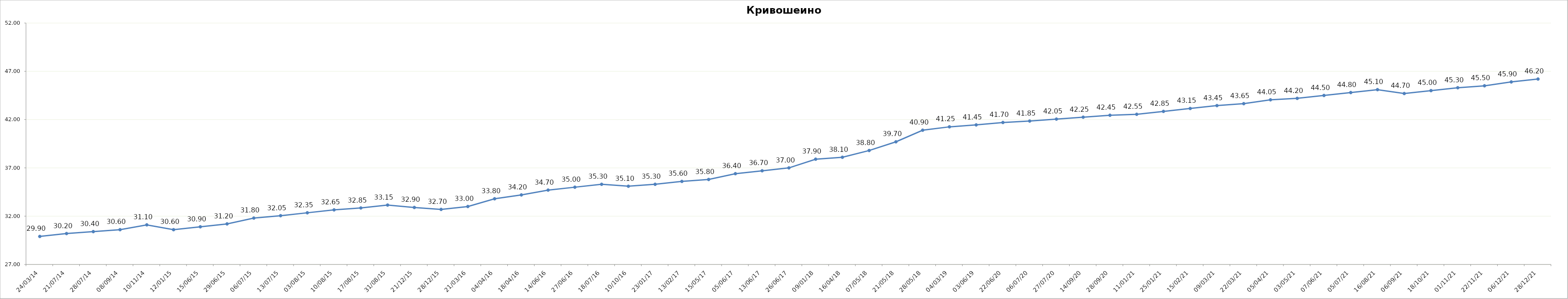
| Category | Series 0 |
|---|---|
| 2014-03-24 | 29.9 |
| 2014-07-21 | 30.2 |
| 2014-07-28 | 30.4 |
| 2014-09-08 | 30.6 |
| 2014-11-10 | 31.1 |
| 2015-01-12 | 30.6 |
| 2015-06-15 | 30.9 |
| 2015-06-29 | 31.2 |
| 2015-07-06 | 31.8 |
| 2015-07-13 | 32.05 |
| 2015-08-03 | 32.35 |
| 2015-08-10 | 32.65 |
| 2015-08-17 | 32.85 |
| 2015-08-31 | 33.15 |
| 2015-12-21 | 32.9 |
| 2015-12-28 | 32.7 |
| 2016-03-21 | 33 |
| 2016-04-04 | 33.8 |
| 2016-04-18 | 34.2 |
| 2016-06-14 | 34.7 |
| 2016-06-27 | 35 |
| 2016-07-18 | 35.3 |
| 2016-10-10 | 35.1 |
| 2017-01-23 | 35.3 |
| 2017-02-13 | 35.6 |
| 2017-05-15 | 35.8 |
| 2017-06-05 | 36.4 |
| 2017-06-13 | 36.7 |
| 2017-06-26 | 37 |
| 2018-01-09 | 37.9 |
| 2018-04-16 | 38.1 |
| 2018-05-07 | 38.8 |
| 2018-05-21 | 39.7 |
| 2018-05-28 | 40.9 |
| 2019-03-04 | 41.25 |
| 2019-06-03 | 41.45 |
| 2020-06-22 | 41.7 |
| 2020-07-06 | 41.85 |
| 2020-07-27 | 42.05 |
| 2020-09-14 | 42.25 |
| 2020-09-28 | 42.45 |
| 2021-01-11 | 42.55 |
| 2021-01-25 | 42.85 |
| 2021-02-15 | 43.15 |
| 2021-03-09 | 43.45 |
| 2021-03-22 | 43.65 |
| 2021-04-05 | 44.05 |
| 2021-05-03 | 44.2 |
| 2021-06-07 | 44.5 |
| 2021-07-05 | 44.8 |
| 2021-08-16 | 45.1 |
| 2021-09-06 | 44.7 |
| 2021-10-18 | 45 |
| 2021-11-01 | 45.3 |
| 2021-11-22 | 45.5 |
| 2021-12-06 | 45.9 |
| 2021-12-28 | 46.2 |